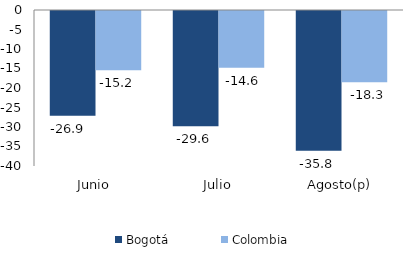
| Category | Bogotá | Colombia |
|---|---|---|
| Junio | -26.873 | -15.183 |
| Julio | -29.556 | -14.569 |
| Agosto(p) | -35.814 | -18.283 |